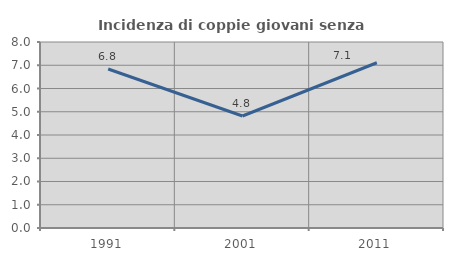
| Category | Incidenza di coppie giovani senza figli |
|---|---|
| 1991.0 | 6.84 |
| 2001.0 | 4.818 |
| 2011.0 | 7.107 |